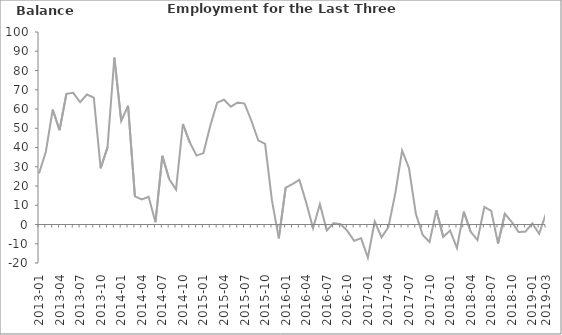
| Category | Balance |
|---|---|
| 2013-01 | 26.5 |
|  | 37.8 |
|  | 59.7 |
| 2013-04 | 49 |
|  | 67.9 |
|  | 68.4 |
| 2013-07 | 63.5 |
|  | 67.5 |
|  | 65.9 |
| 2013-10 | 29.2 |
|  | 40.1 |
|  | 86.7 |
| 2014-01 | 53.8 |
|  | 61.7 |
|  | 14.6 |
| 2014-04 | 13 |
|  | 14.4 |
|  | 1.2 |
| 2014-07 | 35.7 |
|  | 23.6 |
|  | 18.1 |
| 2014-10 | 52.2 |
|  | 42.7 |
|  | 35.8 |
| 2015-01 | 37.1 |
|  | 51.3 |
|  | 63.3 |
| 2015-04 | 64.8 |
|  | 61.2 |
|  | 63.4 |
| 2015-07 | 62.8 |
|  | 53.9 |
|  | 43.7 |
| 2015-10 | 41.9 |
|  | 12.5 |
|  | -7.2 |
| 2016-01 | 19.1 |
|  | 21 |
|  | 23.2 |
| 2016-04 | 11.4 |
|  | -1.9 |
|  | 10.6 |
| 2016-07 | -3.1 |
|  | 0.7 |
|  | 0.2 |
| 2016-10 | -3.3 |
|  | -8.5 |
|  | -7.1 |
| 2017-01 | -17.2 |
|  | 1.6 |
|  | -6.7 |
| 2017-04 | -1.3 |
|  | 16.1 |
|  | 38.4 |
| 2017-07 | 29.3 |
|  | 5.6 |
|  | -5.4 |
| 2017-10 | -9.1 |
|  | 7.4 |
|  | -6.5 |
| 2018-01 | -3.1 |
|  | -12.2 |
|  | 6.7 |
| 2018-04 | -3.7 |
|  | -8.1 |
|  | 9.1 |
| 2018-07 | 7.1 |
|  | -9.9 |
|  | 5.6 |
| 2018-10 | 1.3 |
|  | -3.9 |
|  | -3.7 |
| 2019-01 | 0.6 |
|  | -4.8 |
| 2019-03 | 5.7 |